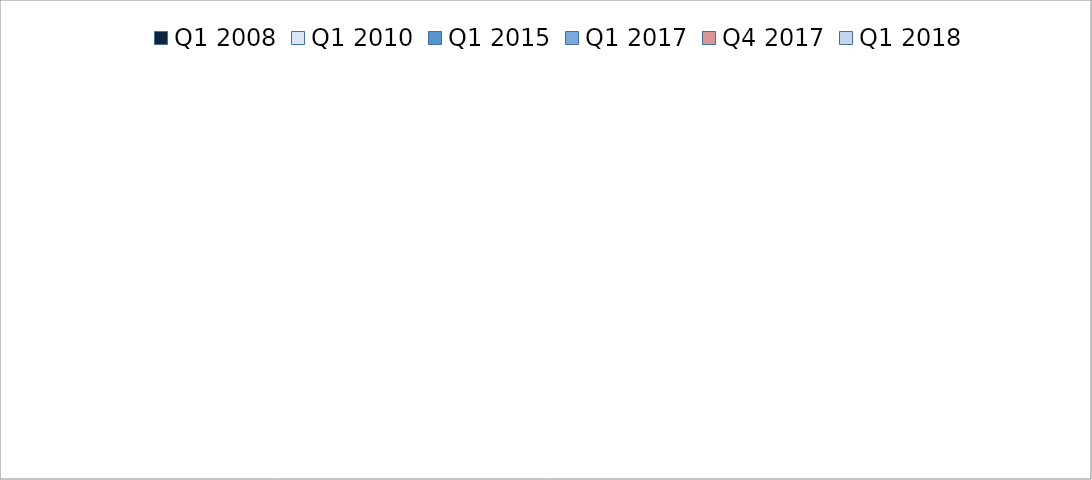
| Category | Q1 2008 | Q1 2010 | Q1 2015 | Q1 2017 | Q4 2017 | Q1 2018 |
|---|---|---|---|---|---|---|
| Food, beverages, and tobacco | 310.959 | 293.224 | 385.257 | 385.535 | 383.982 | 386.391 |
| Clothing, textiles and footwear | 288.283 | 249.89 | 214.255 | 232.506 | 250.152 | 264.314 |
| Wood and paper | 178.875 | 145.593 | 147.908 | 120.33 | 127.744 | 125.317 |
| Publishing 
and printing | 92.54 | 103.795 | 70.953 | 80.615 | 63.935 | 70.713 |
| Petroleum, chemicals, rubber, and plastic | 274.95 | 225.455 | 203.968 | 244.98 | 218.923 | 233.843 |
| Glass and non-
metallic minerals | 127.857 | 97.789 | 104.973 | 124.169 | 104.623 | 111.476 |
| Metals and 
metal products | 347.18 | 311.768 | 299.167 | 280.552 | 277.15 | 294.409 |
| Machinery, equiptment, and 
appliances | 191.925 | 166.227 | 123.576 | 134.409 | 154.184 | 181.162 |
| Transport 
equipment | 163.33 | 140.767 | 118.496 | 92.754 | 107.211 | 97.581 |
| Furniture, 
and other | 135.401 | 111.808 | 110.043 | 93.927 | 102.719 | 83.809 |